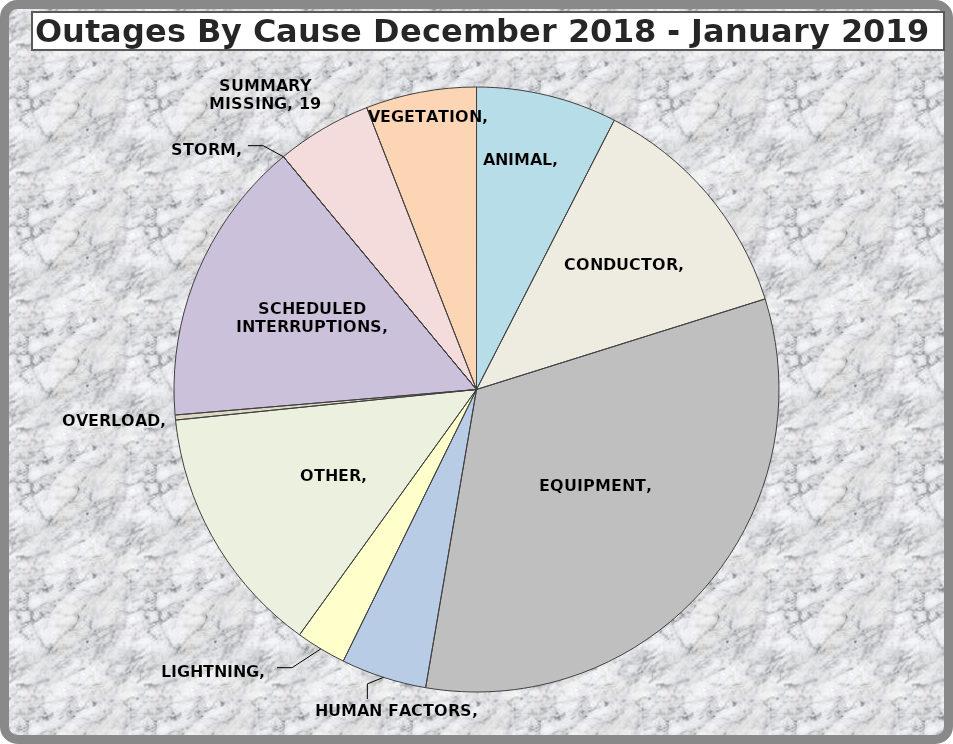
| Category | Series 0 |
|---|---|
| ANIMAL | 28 |
| CONDUCTOR | 47 |
| EQUIPMENT | 121 |
| HUMAN FACTORS | 17 |
| LIGHTNING | 10 |
| OTHER | 50 |
| OVERLOAD | 1 |
| SCHEDULED INTERRUPTIONS | 57 |
| STORM | 0 |
| SUMMARY MISSING | 19 |
| VEGETATION | 22 |